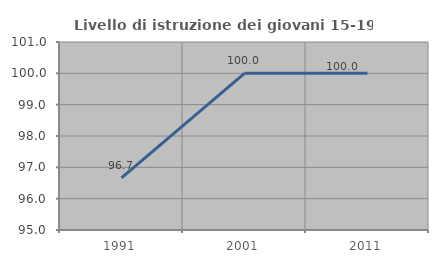
| Category | Livello di istruzione dei giovani 15-19 anni |
|---|---|
| 1991.0 | 96.667 |
| 2001.0 | 100 |
| 2011.0 | 100 |